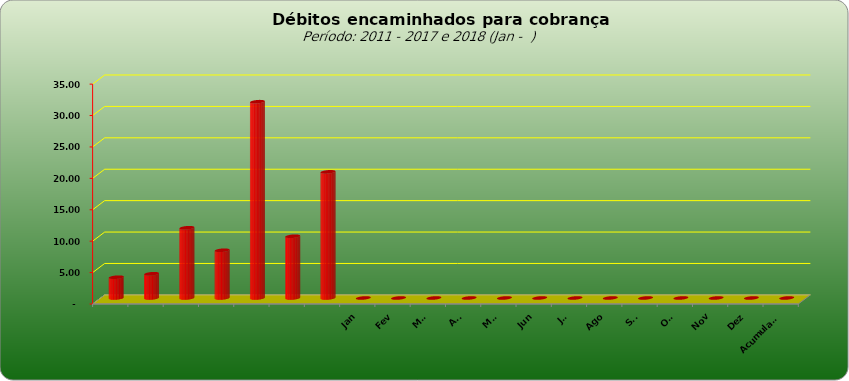
| Category |  3.309.443,02  |
|---|---|
|  | 3309443.02 |
|  | 3859728.44 |
|  | 11181928.25 |
|  | 7600526.01 |
|  | 31248623.5 |
|  | 9830198.34 |
|  | 20083556.95 |
| Jan | 0 |
| Fev | 0 |
| Mar | 0 |
| Abr | 0 |
| Mai | 0 |
| Jun | 0 |
| Jul | 0 |
| Ago | 0 |
| Set | 0 |
| Out | 0 |
| Nov | 0 |
| Dez | 0 |
| Acumulado | 0 |